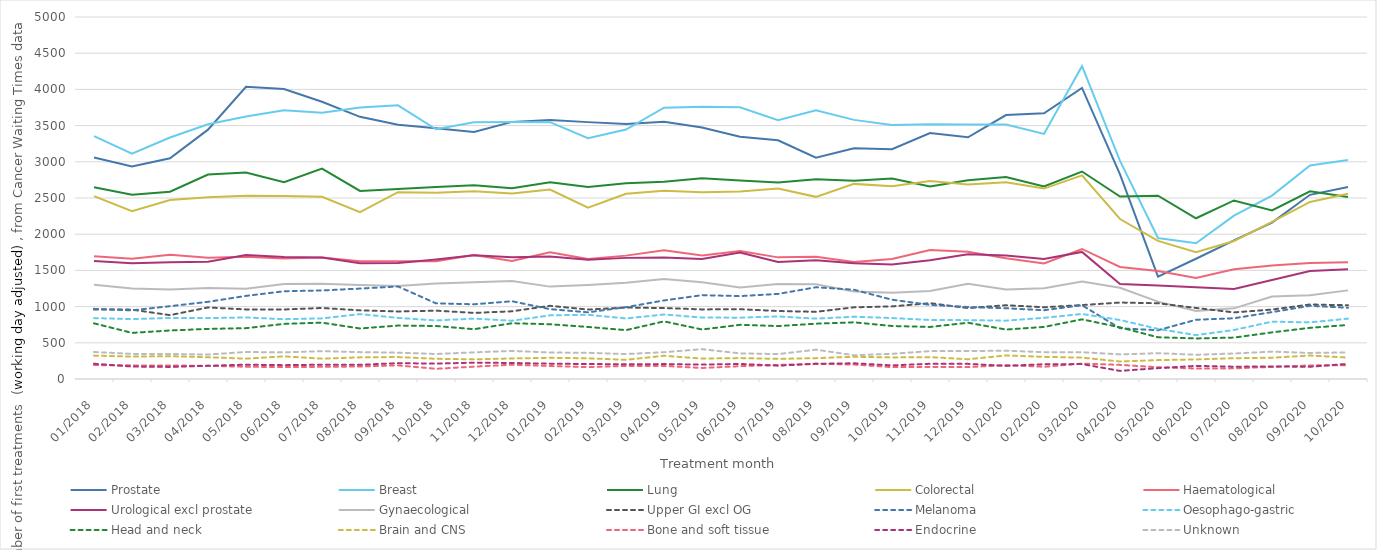
| Category | Prostate | Breast | Lung | Colorectal | Haematological | Urological excl prostate | Gynaecological | Upper GI excl OG | Melanoma | Oesophago-gastric | Head and neck | Brain and CNS | Bone and soft tissue | Endocrine | Unknown |
|---|---|---|---|---|---|---|---|---|---|---|---|---|---|---|---|
| 2018-01-01 | 3059 | 3354 | 2649 | 2526 | 1694 | 1631 | 1301 | 961 | 969 | 841 | 769 | 323 | 192 | 211 | 373 |
| 2018-02-01 | 2937 | 3113 | 2544 | 2318 | 1661 | 1598 | 1251 | 958 | 948 | 827 | 637 | 310 | 188 | 172 | 347 |
| 2018-03-01 | 3049 | 3335 | 2586 | 2473 | 1715 | 1614 | 1235 | 882 | 1006 | 843 | 670 | 315 | 187 | 167 | 345 |
| 2018-04-01 | 3444 | 3518 | 2825 | 2511 | 1676 | 1620 | 1258 | 988 | 1066 | 841 | 692 | 301 | 182 | 182 | 338 |
| 2018-05-01 | 4037 | 3625 | 2852 | 2531 | 1687 | 1712 | 1246 | 961 | 1148 | 850 | 702 | 281 | 169 | 198 | 373 |
| 2018-06-01 | 4005 | 3711 | 2719 | 2526 | 1664 | 1684 | 1313 | 960 | 1212 | 826 | 761 | 313 | 164 | 191 | 368 |
| 2018-07-01 | 3830 | 3678 | 2906 | 2517 | 1677 | 1678 | 1314 | 981 | 1223 | 837 | 778 | 281 | 168 | 198 | 385 |
| 2018-08-01 | 3621 | 3751 | 2598 | 2304 | 1628 | 1600 | 1300 | 948 | 1249 | 896 | 698 | 299 | 172 | 196 | 371 |
| 2018-09-01 | 3512 | 3780 | 2624 | 2581 | 1626 | 1602 | 1285 | 933 | 1278 | 844 | 738 | 303 | 188 | 219 | 364 |
| 2018-10-01 | 3462 | 3449 | 2653 | 2572 | 1628 | 1651 | 1320 | 944 | 1045 | 809 | 732 | 279 | 141 | 212 | 345 |
| 2018-11-01 | 3413 | 3547 | 2675 | 2592 | 1714 | 1710 | 1337 | 913 | 1032 | 834 | 688 | 271 | 170 | 226 | 368 |
| 2018-12-01 | 3551 | 3550 | 2635 | 2563 | 1631 | 1680 | 1354 | 935 | 1074 | 805 | 770 | 284 | 198 | 221 | 388 |
| 2019-01-01 | 3578 | 3547 | 2716 | 2616 | 1752 | 1693 | 1276 | 1011 | 965 | 879 | 756 | 293 | 179 | 212 | 366 |
| 2019-02-01 | 3548 | 3325 | 2651 | 2367 | 1659 | 1646 | 1298 | 959 | 921 | 887 | 719 | 286 | 165 | 207 | 362 |
| 2019-03-01 | 3523 | 3446 | 2705 | 2558 | 1704 | 1673 | 1331 | 987 | 992 | 836 | 675 | 265 | 181 | 203 | 345 |
| 2019-04-01 | 3554 | 3747 | 2723 | 2599 | 1778 | 1677 | 1380 | 980 | 1085 | 891 | 796 | 321 | 181 | 206 | 370 |
| 2019-05-01 | 3473 | 3761 | 2772 | 2578 | 1707 | 1659 | 1337 | 961 | 1158 | 849 | 684 | 282 | 152 | 199 | 412 |
| 2019-06-01 | 3347 | 3752 | 2742 | 2589 | 1768 | 1746 | 1265 | 964 | 1145 | 847 | 748 | 289 | 177 | 208 | 354 |
| 2019-07-01 | 3297 | 3576 | 2713 | 2632 | 1680 | 1615 | 1311 | 939 | 1175 | 864 | 731 | 278 | 195 | 184 | 344 |
| 2019-08-01 | 3058 | 3712 | 2759 | 2516 | 1687 | 1639 | 1307 | 928 | 1267 | 834 | 764 | 288 | 210 | 210 | 405 |
| 2019-09-01 | 3188 | 3579 | 2739 | 2695 | 1617 | 1599 | 1209 | 990 | 1233 | 860 | 783 | 307 | 200 | 217 | 328 |
| 2019-10-01 | 3175 | 3507 | 2769 | 2662 | 1657 | 1580 | 1191 | 1003 | 1095 | 842 | 732 | 298 | 164 | 188 | 348 |
| 2019-11-01 | 3396 | 3517 | 2658 | 2735 | 1782 | 1640 | 1214 | 1047 | 1024 | 815 | 719 | 302 | 167 | 210 | 385 |
| 2019-12-01 | 3338 | 3514 | 2745 | 2686 | 1756 | 1723 | 1315 | 980 | 994 | 813 | 777 | 273 | 164 | 209 | 387 |
| 2020-01-01 | 3646 | 3515 | 2790 | 2718 | 1669 | 1706 | 1235 | 1019 | 977 | 806 | 683 | 325 | 192 | 181 | 390 |
| 2020-02-01 | 3669 | 3385 | 2660 | 2630 | 1595 | 1658 | 1253 | 991 | 950 | 845 | 719 | 306 | 169 | 204 | 371 |
| 2020-03-01 | 4020 | 4321 | 2866 | 2812 | 1796 | 1755 | 1346 | 1021 | 1019 | 898 | 824 | 295 | 213 | 206 | 370 |
| 2020-04-01 | 2825 | 3012 | 2520 | 2210 | 1548 | 1313 | 1261 | 1056 | 700 | 815 | 714 | 242 | 195 | 112 | 340 |
| 2020-05-01 | 1413 | 1947 | 2531 | 1908 | 1493 | 1290 | 1069 | 1046 | 674 | 692 | 576 | 261 | 162 | 150 | 357 |
| 2020-06-01 | 1661 | 1875 | 2220 | 1750 | 1395 | 1267 | 938 | 981 | 818 | 606 | 560 | 270 | 144 | 181 | 335 |
| 2020-07-02 | 1916 | 2256 | 2466 | 1905 | 1517 | 1244 | 976 | 920 | 839 | 677 | 572 | 287 | 147 | 170 | 352 |
| 2020-08-01 | 2161 | 2533 | 2329 | 2170 | 1566 | 1367 | 1139 | 959 | 924 | 792 | 644 | 294 | 167 | 173 | 378 |
| 2020-09-02 | 2544 | 2950 | 2593 | 2445 | 1602 | 1493 | 1156 | 1029 | 1011 | 782 | 707 | 324 | 188 | 169 | 360 |
| 2020-10-01 | 2652 | 3026 | 2514 | 2560 | 1612 | 1515 | 1224 | 1019 | 984 | 834 | 746 | 296 | 189 | 209 | 367 |